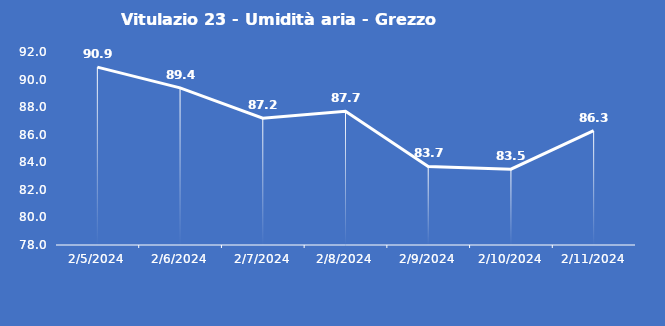
| Category | Vitulazio 23 - Umidità aria - Grezzo (%) |
|---|---|
| 2/5/24 | 90.9 |
| 2/6/24 | 89.4 |
| 2/7/24 | 87.2 |
| 2/8/24 | 87.7 |
| 2/9/24 | 83.7 |
| 2/10/24 | 83.5 |
| 2/11/24 | 86.3 |